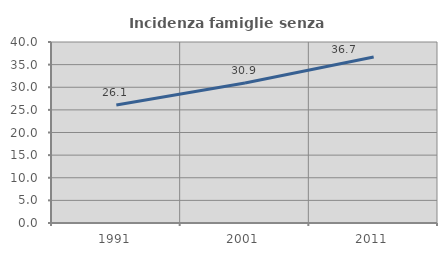
| Category | Incidenza famiglie senza nuclei |
|---|---|
| 1991.0 | 26.074 |
| 2001.0 | 30.927 |
| 2011.0 | 36.7 |